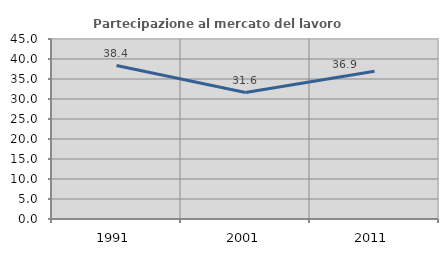
| Category | Partecipazione al mercato del lavoro  femminile |
|---|---|
| 1991.0 | 38.364 |
| 2001.0 | 31.62 |
| 2011.0 | 36.914 |